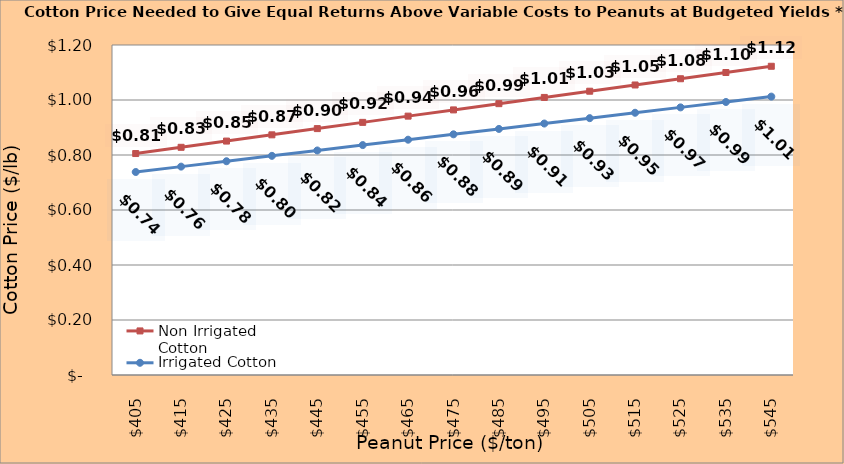
| Category | Non Irrigated Cotton | Irrigated Cotton |
|---|---|---|
| 405.0 | 0.805 | 0.738 |
| 415.0 | 0.828 | 0.758 |
| 425.0 | 0.851 | 0.777 |
| 435.0 | 0.873 | 0.797 |
| 445.0 | 0.896 | 0.817 |
| 455.0 | 0.919 | 0.836 |
| 465.0 | 0.941 | 0.856 |
| 475.0 | 0.964 | 0.875 |
| 485.0 | 0.987 | 0.895 |
| 495.0 | 1.009 | 0.914 |
| 505.0 | 1.032 | 0.934 |
| 515.0 | 1.055 | 0.954 |
| 525.0 | 1.077 | 0.973 |
| 535.0 | 1.1 | 0.993 |
| 545.0 | 1.123 | 1.012 |